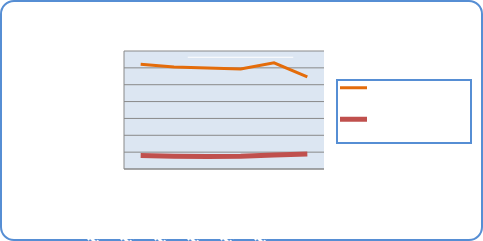
| Category | Motorin Türleri  | Benzin Türleri |
|---|---|---|
| 10/15/18 | 62145858.125 | 7945248.634 |
| 10/16/18 | 60463538.669 | 7603034.882 |
| 10/17/18 | 59917311.898 | 7416601.625 |
| 10/18/18 | 59379909.644 | 7497860.479 |
| 10/19/18 | 62969107.87 | 8275372.333 |
| 10/20/18 | 54639577.887 | 8845053.87 |